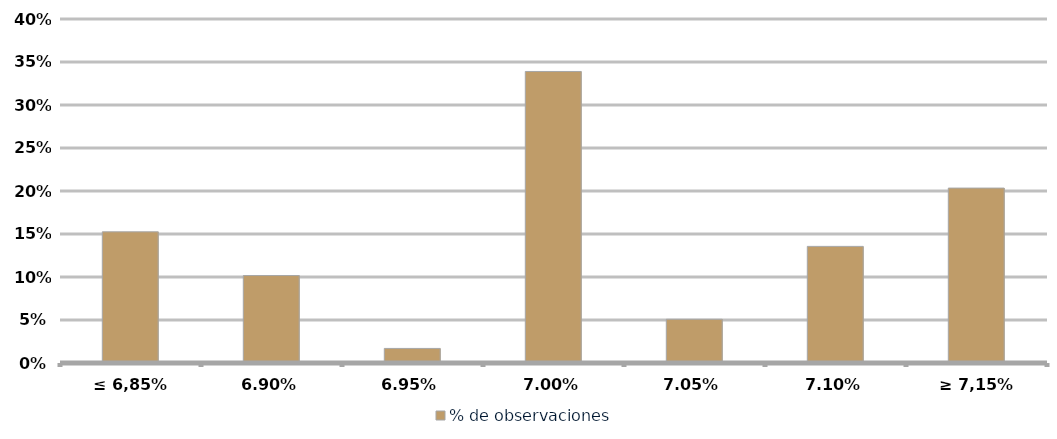
| Category | % de observaciones  |
|---|---|
| ≤ 6,85% | 0.153 |
| 6,90% | 0.102 |
| 6,95% | 0.017 |
| 7,00% | 0.339 |
| 7,05% | 0.051 |
| 7,10% | 0.136 |
| ≥ 7,15% | 0.203 |